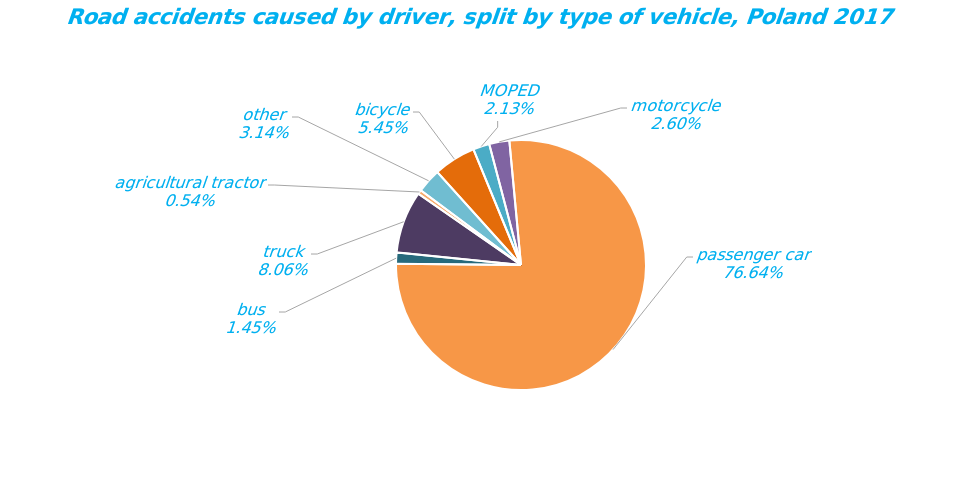
| Category | Series 0 |
|---|---|
| bicycle | 1546 |
| MOPED | 603 |
| motorcycle | 738 |
| passenger car | 21733 |
| bus | 411 |
| truck | 2285 |
| agricultural tractor | 152 |
| other | 891 |